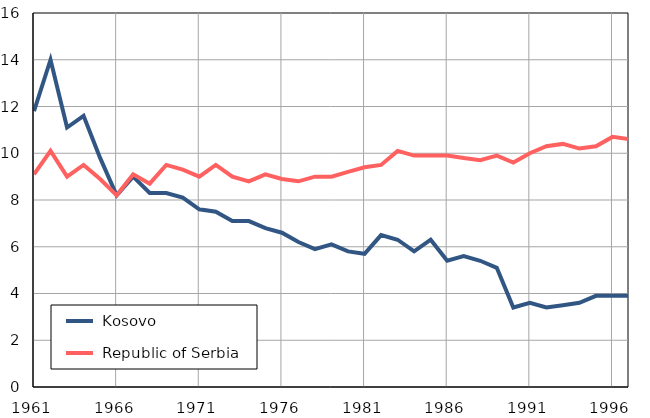
| Category |  Kosovo |  Republic of Serbia |
|---|---|---|
| 1961.0 | 11.8 | 9.1 |
| 1962.0 | 14 | 10.1 |
| 1963.0 | 11.1 | 9 |
| 1964.0 | 11.6 | 9.5 |
| 1965.0 | 9.8 | 8.9 |
| 1966.0 | 8.2 | 8.2 |
| 1967.0 | 9 | 9.1 |
| 1968.0 | 8.3 | 8.7 |
| 1969.0 | 8.3 | 9.5 |
| 1970.0 | 8.1 | 9.3 |
| 1971.0 | 7.6 | 9 |
| 1972.0 | 7.5 | 9.5 |
| 1973.0 | 7.1 | 9 |
| 1974.0 | 7.1 | 8.8 |
| 1975.0 | 6.8 | 9.1 |
| 1976.0 | 6.6 | 8.9 |
| 1977.0 | 6.2 | 8.8 |
| 1978.0 | 5.9 | 9 |
| 1979.0 | 6.1 | 9 |
| 1980.0 | 5.8 | 9.2 |
| 1981.0 | 5.7 | 9.4 |
| 1982.0 | 6.5 | 9.5 |
| 1983.0 | 6.3 | 10.1 |
| 1984.0 | 5.8 | 9.9 |
| 1985.0 | 6.3 | 9.9 |
| 1986.0 | 5.4 | 9.9 |
| 1987.0 | 5.6 | 9.8 |
| 1988.0 | 5.4 | 9.7 |
| 1989.0 | 5.1 | 9.9 |
| 1990.0 | 3.4 | 9.6 |
| 1991.0 | 3.6 | 10 |
| 1992.0 | 3.4 | 10.3 |
| 1993.0 | 3.5 | 10.4 |
| 1994.0 | 3.6 | 10.2 |
| 1995.0 | 3.9 | 10.3 |
| 1996.0 | 3.9 | 10.7 |
| 1997.0 | 3.9 | 10.6 |